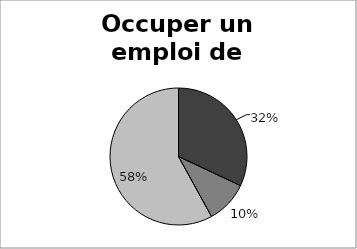
| Category | Occuper un emploi de catégorie cadre |
|---|---|
| 0 | 0.32 |
| 1 | 0.1 |
| 2 | 0.58 |